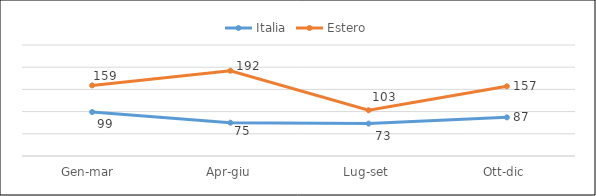
| Category | Italia | Estero |
|---|---|---|
| Gen-mar  | 99 | 159 |
| Apr-giu | 75 | 192 |
| Lug-set | 73 | 103 |
| Ott-dic | 87 | 157 |